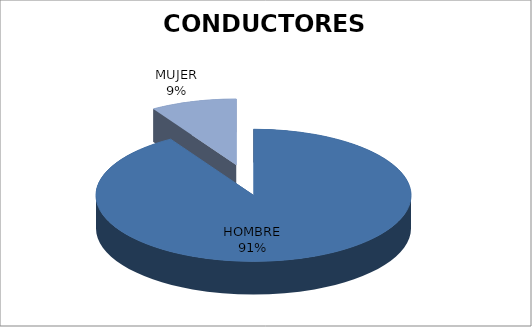
| Category | E.E. |
|---|---|
| HOMBRE | 31 |
| MUJER | 3 |